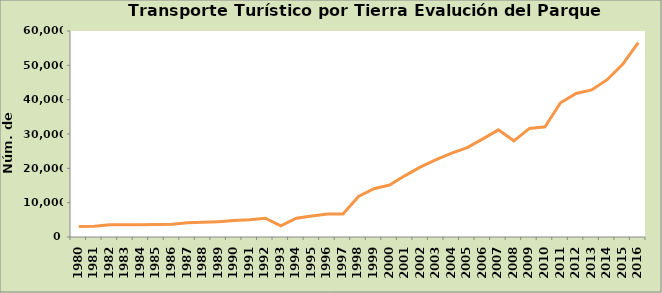
| Category | Series 0 |
|---|---|
| 1980.0 | 3070 |
| 1981.0 | 3150 |
| 1982.0 | 3550 |
| 1983.0 | 3589 |
| 1984.0 | 3596 |
| 1985.0 | 3674 |
| 1986.0 | 3718 |
| 1987.0 | 4127 |
| 1988.0 | 4266 |
| 1989.0 | 4476 |
| 1990.0 | 4782 |
| 1991.0 | 5005 |
| 1992.0 | 5481 |
| 1993.0 | 3240 |
| 1994.0 | 5476 |
| 1995.0 | 6137 |
| 1996.0 | 6706 |
| 1997.0 | 6729 |
| 1998.0 | 11793 |
| 1999.0 | 14048 |
| 2000.0 | 15124 |
| 2001.0 | 17889 |
| 2002.0 | 20424 |
| 2003.0 | 22561 |
| 2004.0 | 24419 |
| 2005.0 | 26044 |
| 2006.0 | 28579 |
| 2007.0 | 31203 |
| 2008.0 | 28008 |
| 2009.0 | 31619 |
| 2010.0 | 32105 |
| 2011.0 | 39093 |
| 2012.0 | 41813 |
| 2013.0 | 42836 |
| 2014.0 | 45817 |
| 2015.0 | 50284 |
| 2016.0 | 56598 |